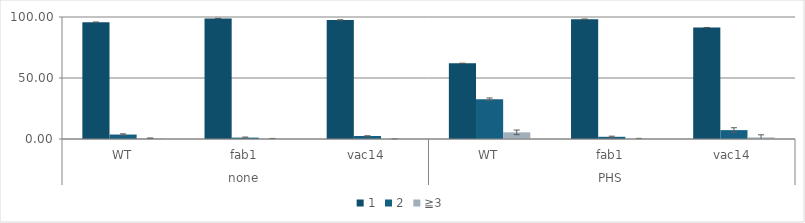
| Category | 1 | 2 | ≧3 |
|---|---|---|---|
| 0 | 95.726 | 3.662 | 0.612 |
| 1 | 98.867 | 1.133 | 0 |
| 2 | 97.535 | 2.465 | 0 |
| 3 | 62.027 | 32.524 | 5.449 |
| 4 | 98.188 | 1.812 | 0 |
| 5 | 91.41 | 7.274 | 1.316 |